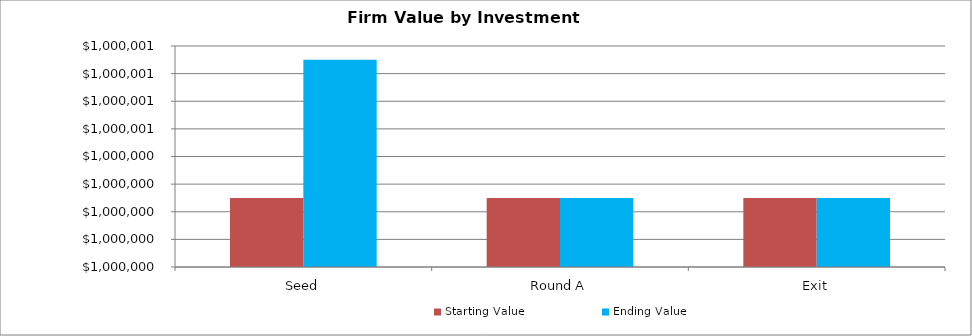
| Category | Starting Value | Ending Value |
|---|---|---|
| Seed | 1000000 | 1000001 |
| Round A | 1000000 | 1000000 |
| Exit | 1000000 | 1000000 |